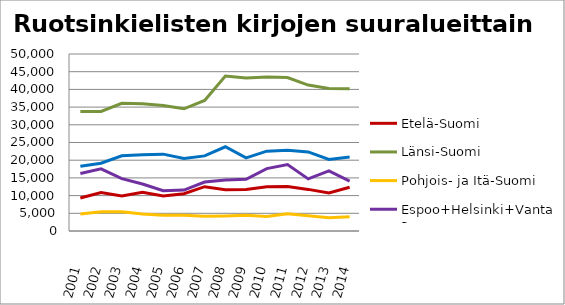
| Category | Etelä-Suomi | Länsi-Suomi | Pohjois- ja Itä-Suomi | Espoo+Helsinki+Vantaa | Muu Uusimaa |
|---|---|---|---|---|---|
| 2001.0 | 9340 | 33761 | 4815 | 16250 | 18278 |
| 2002.0 | 10866 | 33754 | 5408 | 17552 | 19148 |
| 2003.0 | 9909 | 36069 | 5434 | 14780 | 21248 |
| 2004.0 | 10948 | 35932 | 4797 | 13282 | 21553 |
| 2005.0 | 9877 | 35441 | 4465 | 11363 | 21711 |
| 2006.0 | 10540 | 34512 | 4414 | 11556 | 20493 |
| 2007.0 | 12519 | 36864 | 4150 | 13835 | 21225 |
| 2008.0 | 11686 | 43790 | 4267 | 14382 | 23795 |
| 2009.0 | 11719 | 43238 | 4458 | 14591 | 20668 |
| 2010.0 | 12504 | 43513 | 4093 | 17626 | 22547 |
| 2011.0 | 12593 | 43354 | 4852 | 18773 | 22816 |
| 2012.0 | 11754 | 41227 | 4320 | 14714 | 22346 |
| 2013.0 | 10731 | 40281 | 3754 | 16978 | 20227 |
| 2014.0 | 12355 | 40201 | 3998 | 14097 | 20881 |